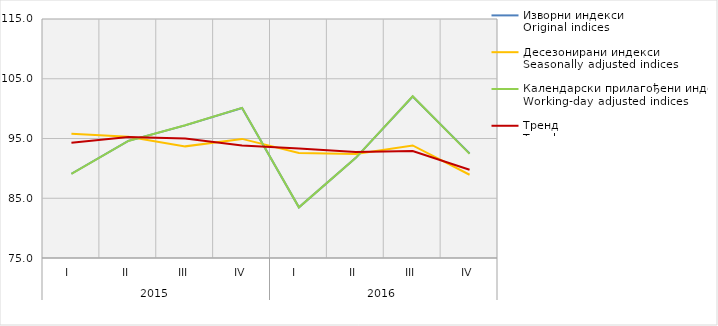
| Category | Изворни индекси
Original indices | Десезонирани индекси
Seasonally adjusted indices | Календарски прилагођени индекси
Working-day adjusted indices | Тренд
Trend |
|---|---|---|---|---|
| 0 | 89.1 | 95.802 | 89.066 | 94.292 |
| 1 | 94.6 | 95.311 | 94.58 | 95.257 |
| 2 | 97.2 | 93.683 | 97.225 | 94.988 |
| 3 | 100.1 | 94.934 | 100.131 | 93.809 |
| 4 | 83.476 | 92.58 | 83.476 | 93.31 |
| 5 | 91.763 | 92.422 | 91.763 | 92.732 |
| 6 | 102.022 | 93.832 | 102.062 | 92.907 |
| 7 | 92.509 | 88.933 | 92.428 | 89.772 |